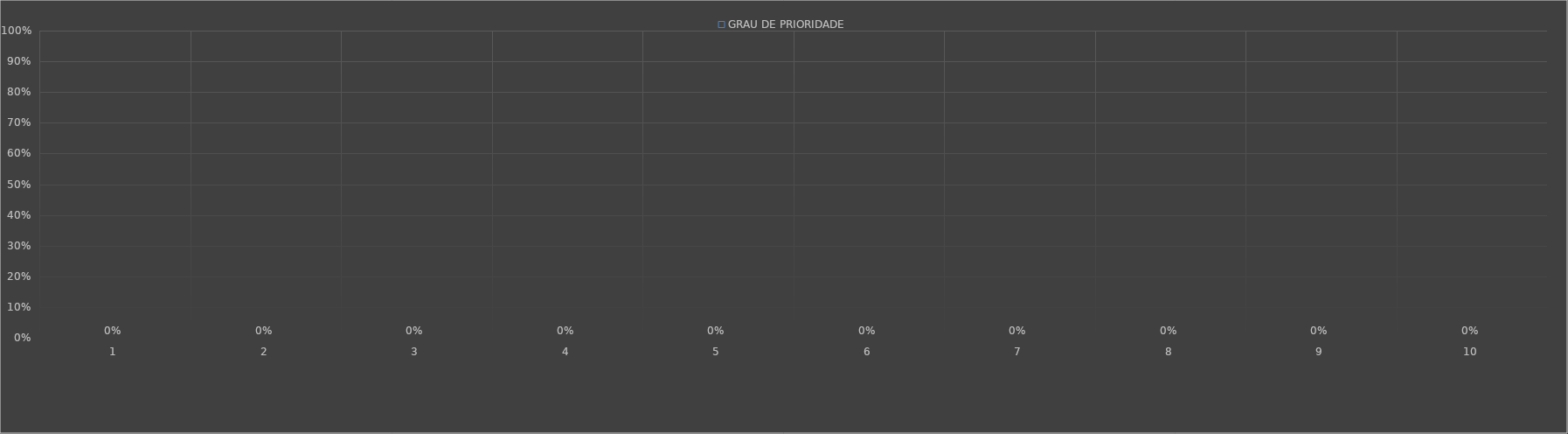
| Category | GRAU DE PRIORIDADE |
|---|---|
| 0 | 0 |
| 1 | 0 |
| 2 | 0 |
| 3 | 0 |
| 4 | 0 |
| 5 | 0 |
| 6 | 0 |
| 7 | 0 |
| 8 | 0 |
| 9 | 0 |